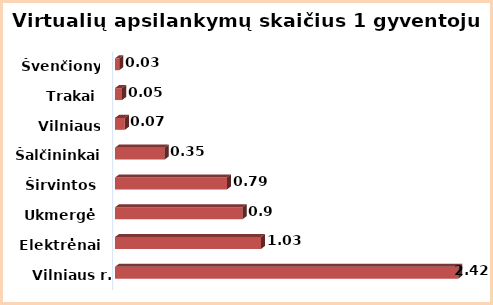
| Category | Series 0 |
|---|---|
| Vilniaus r. | 2.42 |
| Elektrėnai | 1.03 |
| Ukmergė | 0.9 |
| Širvintos | 0.79 |
| Šalčininkai | 0.35 |
| Vilniaus m. | 0.07 |
| Trakai | 0.05 |
| Švenčionys | 0.03 |